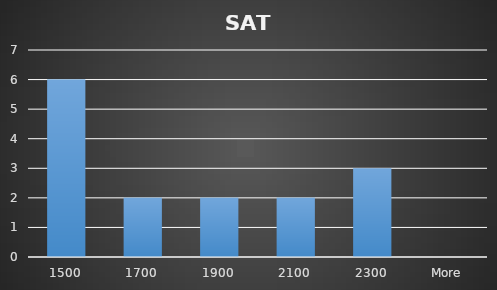
| Category | Frequency |
|---|---|
| 1500 | 6 |
| 1700 | 2 |
| 1900 | 2 |
| 2100 | 2 |
| 2300 | 3 |
| More | 0 |